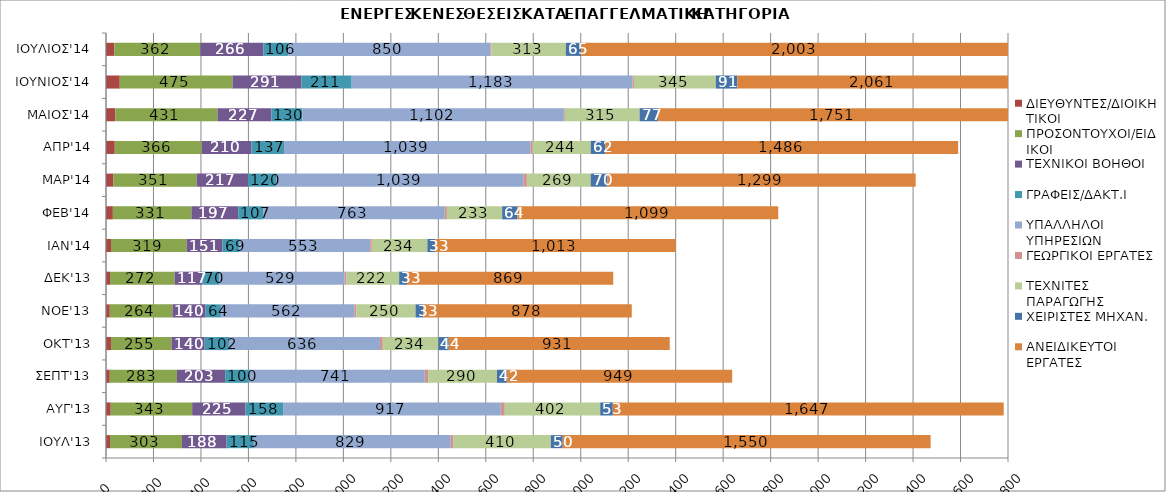
| Category | ΔΙΕΥΘΥΝΤΕΣ/ΔΙΟΙΚΗΤΙΚΟΙ | ΠΡΟΣΟΝΤΟΥΧΟΙ/ΕΙΔΙΚΟΙ | ΤΕΧΝΙΚΟΙ ΒΟΗΘΟΙ | ΓΡΑΦΕΙΣ/ΔΑΚΤ.Ι | ΥΠΑΛΛΗΛΟΙ ΥΠΗΡΕΣΙΩΝ | ΓΕΩΡΓΙΚΟΙ ΕΡΓΑΤΕΣ | ΤΕΧΝΙΤΕΣ ΠΑΡΑΓΩΓΗΣ | ΧΕΙΡΙΣΤΕΣ ΜΗΧΑΝ. | ΑΝΕΙΔΙΚΕΥΤΟΙ ΕΡΓΑΤΕΣ |
|---|---|---|---|---|---|---|---|---|---|
| ΙΟΥΛ'13 | 17 | 303 | 188 | 115 | 829 | 12 | 410 | 50 | 1550 |
| ΑΥΓ'13 | 20 | 343 | 225 | 158 | 917 | 17 | 402 | 53 | 1647 |
| ΣΕΠΤ'13 | 16 | 283 | 203 | 100 | 741 | 14 | 290 | 42 | 949 |
| ΟΚΤ'13 | 21 | 255 | 140 | 102 | 636 | 12 | 234 | 44 | 931 |
| NOE'13 | 16 | 264 | 140 | 64 | 562 | 8 | 250 | 33 | 878 |
| ΔΕΚ'13 | 17 | 272 | 117 | 70 | 529 | 8 | 222 | 33 | 869 |
| IAN'14 | 21 | 319 | 151 | 69 | 553 | 7 | 234 | 33 | 1013 |
| ΦΕΒ'14 | 29 | 331 | 197 | 107 | 763 | 9 | 233 | 64 | 1099 |
| ΜΑΡ'14 | 31 | 351 | 217 | 120 | 1039 | 15 | 269 | 70 | 1299 |
| ΑΠΡ'14 | 37 | 366 | 210 | 137 | 1039 | 9 | 244 | 62 | 1486 |
| ΜΑΙΟΣ'14 | 39 | 431 | 227 | 130 | 1102 | 4 | 315 | 77 | 1751 |
| ΙΟΥΝΙΟΣ'14 | 58 | 475 | 291 | 211 | 1183 | 6 | 345 | 91 | 2061 |
| ΙΟΥΛΙΟΣ'14 | 35 | 362 | 266 | 106 | 850 | 5 | 313 | 65 | 2003 |